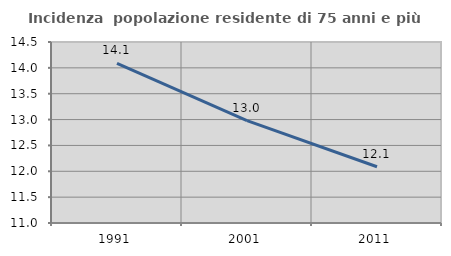
| Category | Incidenza  popolazione residente di 75 anni e più |
|---|---|
| 1991.0 | 14.085 |
| 2001.0 | 12.981 |
| 2011.0 | 12.088 |